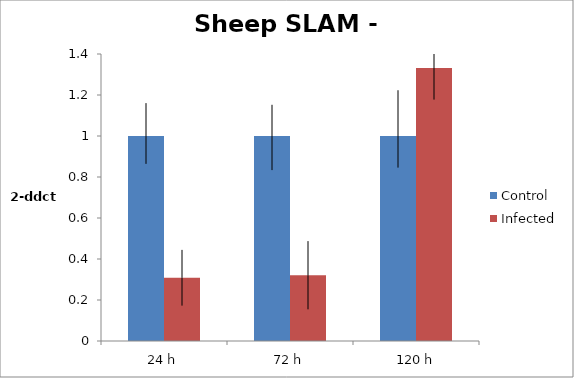
| Category | Control | Infected |
|---|---|---|
| 24 h | 1 | 0.308 |
| 72 h | 1 | 0.321 |
|  120 h | 1 | 1.332 |